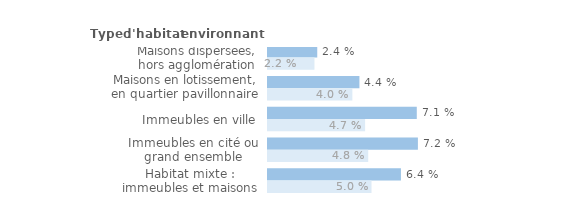
| Category | Series 1 | Series 0 |
|---|---|---|
| Maisons dispersées, hors agglomération | 0.024 | 0.022 |
| Maisons en lotissement, en quartier pavillonnaire | 0.044 | 0.04 |
| Immeubles en ville | 0.071 | 0.047 |
| Immeubles en cité ou grand ensemble | 0.072 | 0.048 |
| Habitat mixte : immeubles et maisons | 0.064 | 0.05 |